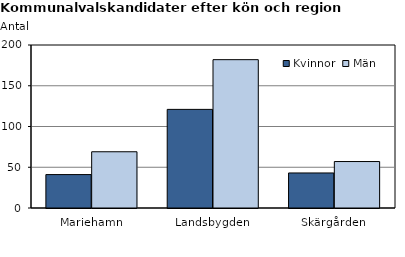
| Category | Kvinnor | Män |
|---|---|---|
| Mariehamn | 41 | 69 |
| Landsbygden | 121 | 182 |
| Skärgården | 43 | 57 |